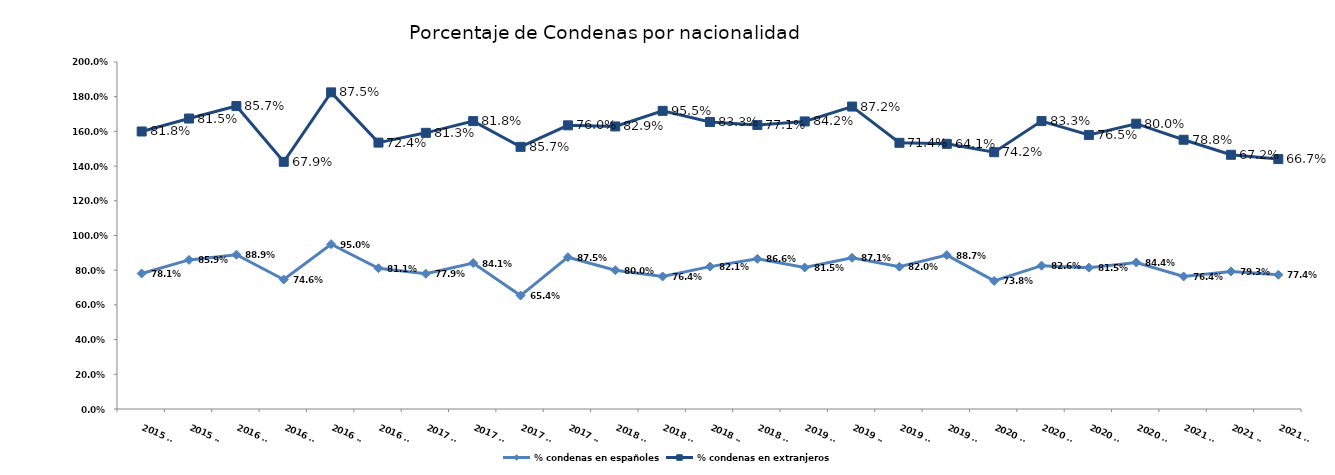
| Category | % condenas en españoles | % condenas en extranjeros |
|---|---|---|
| 2015 T3 | 0.781 | 0.818 |
| 2015 T4 | 0.859 | 0.815 |
| 2016 T1 | 0.889 | 0.857 |
| 2016 T2 | 0.746 | 0.679 |
| 2016 T3 | 0.95 | 0.875 |
| 2016 T4 | 0.811 | 0.724 |
| 2017 T1 | 0.779 | 0.812 |
| 2017 T2 | 0.841 | 0.818 |
| 2017 T3 | 0.654 | 0.857 |
| 2017 T4 | 0.875 | 0.76 |
| 2018 T1 | 0.8 | 0.829 |
| 2018 T2 | 0.764 | 0.955 |
| 2018 T3 | 0.821 | 0.833 |
| 2018 T4 | 0.866 | 0.771 |
| 2019 T1 | 0.815 | 0.842 |
| 2019 T2 | 0.871 | 0.872 |
| 2019 T3 | 0.82 | 0.714 |
| 2019 T4 | 0.887 | 0.641 |
| 2020 T1 | 0.738 | 0.742 |
| 2020 T2 | 0.826 | 0.833 |
| 2020 T3 | 0.815 | 0.765 |
| 2020 T4 | 0.844 | 0.8 |
| 2021 T1 | 0.764 | 0.788 |
| 2021 T2 | 0.793 | 0.672 |
| 2021 T3 | 0.774 | 0.667 |